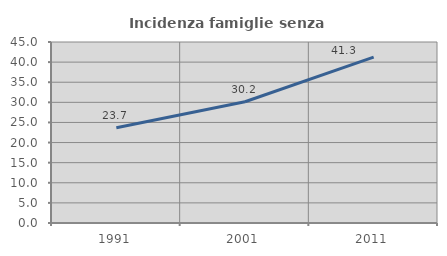
| Category | Incidenza famiglie senza nuclei |
|---|---|
| 1991.0 | 23.661 |
| 2001.0 | 30.154 |
| 2011.0 | 41.256 |